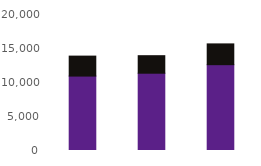
| Category | Online | Telephony |
|---|---|---|
| Aug23 | 10943 | 2938 |
| Sep23 | 11365 | 2579 |
| Oct23 | 12621 | 3057 |